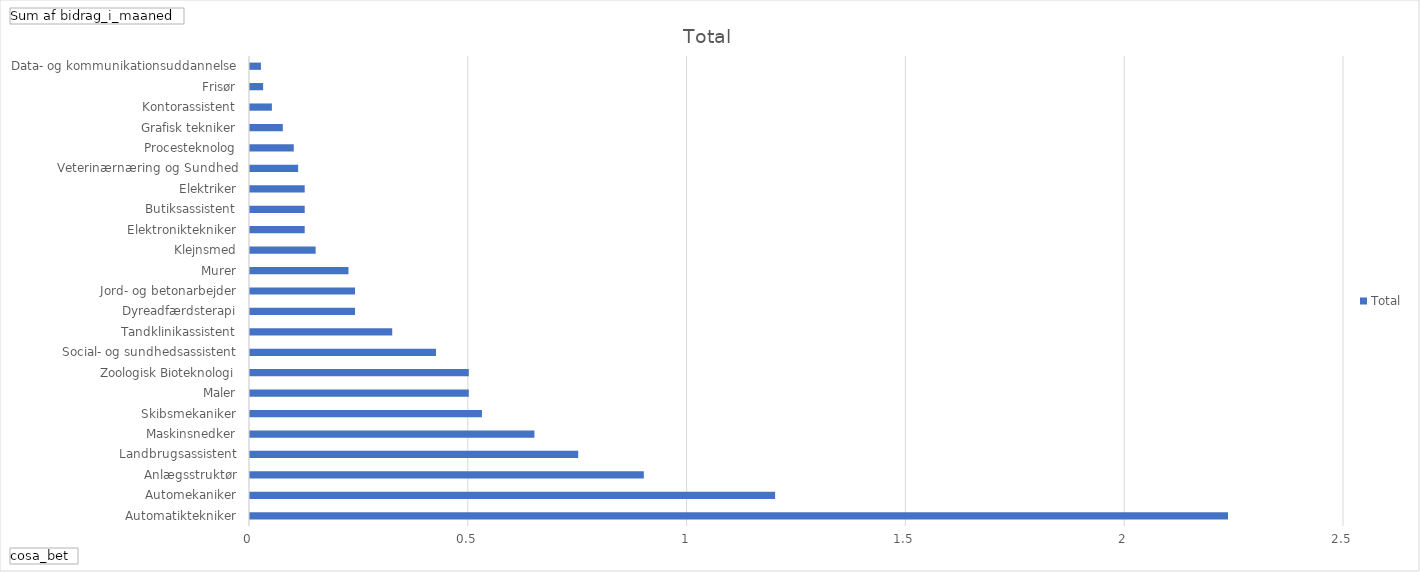
| Category | Total |
|---|---|
| Automatiktekniker | 2.235 |
| Automekaniker | 1.2 |
| Anlægsstruktør | 0.9 |
| Landbrugsassistent | 0.75 |
| Maskinsnedker | 0.65 |
| Skibsmekaniker | 0.53 |
| Maler | 0.5 |
| Zoologisk Bioteknologi | 0.5 |
| Social- og sundhedsassistent | 0.425 |
| Tandklinikassistent | 0.325 |
| Dyreadfærdsterapi | 0.24 |
| Jord- og betonarbejder | 0.24 |
| Murer | 0.225 |
| Klejnsmed | 0.15 |
| Elektroniktekniker | 0.125 |
| Butiksassistent | 0.125 |
| Elektriker | 0.125 |
| Veterinærnæring og Sundhed | 0.11 |
| Procesteknolog | 0.1 |
| Grafisk tekniker | 0.075 |
| Kontorassistent | 0.05 |
| Frisør | 0.03 |
| Data- og kommunikationsuddannelse | 0.025 |